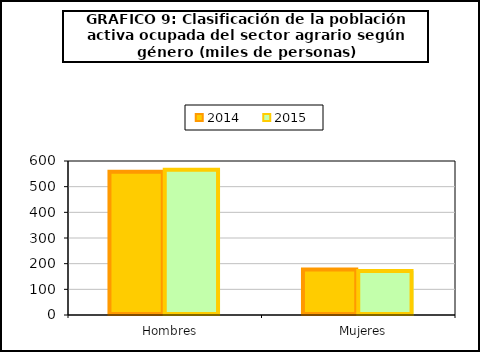
| Category | 2014 | 2015 |
|---|---|---|
|    Hombres | 558.4 | 565.825 |
|    Mujeres | 177.4 | 170.95 |